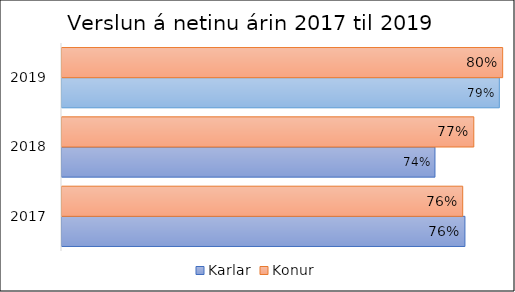
| Category | Karlar | Konur |
|---|---|---|
| 2017.0 | 0.763 | 0.761 |
| 2018.0 | 0.736 | 0.771 |
| 2019.0 | 0.794 | 0.797 |